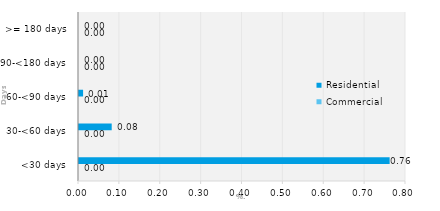
| Category | Commercial | Residential |
|---|---|---|
| <30 days | 0 | 0.76 |
| 30-<60 days | 0 | 0.08 |
| 60-<90 days | 0 | 0.01 |
| 90-<180 days | 0 | 0 |
| >= 180 days | 0 | 0 |